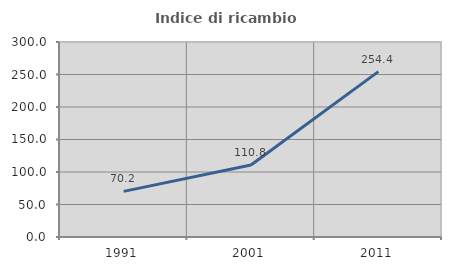
| Category | Indice di ricambio occupazionale  |
|---|---|
| 1991.0 | 70.161 |
| 2001.0 | 110.833 |
| 2011.0 | 254.433 |